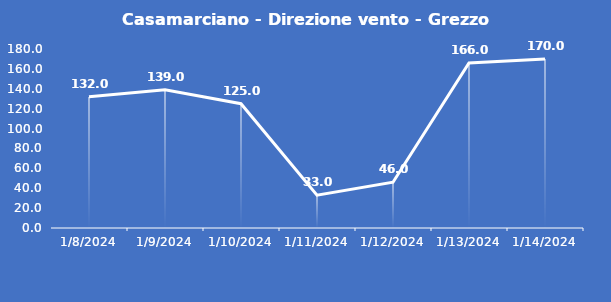
| Category | Casamarciano - Direzione vento - Grezzo (°N) |
|---|---|
| 1/8/24 | 132 |
| 1/9/24 | 139 |
| 1/10/24 | 125 |
| 1/11/24 | 33 |
| 1/12/24 | 46 |
| 1/13/24 | 166 |
| 1/14/24 | 170 |